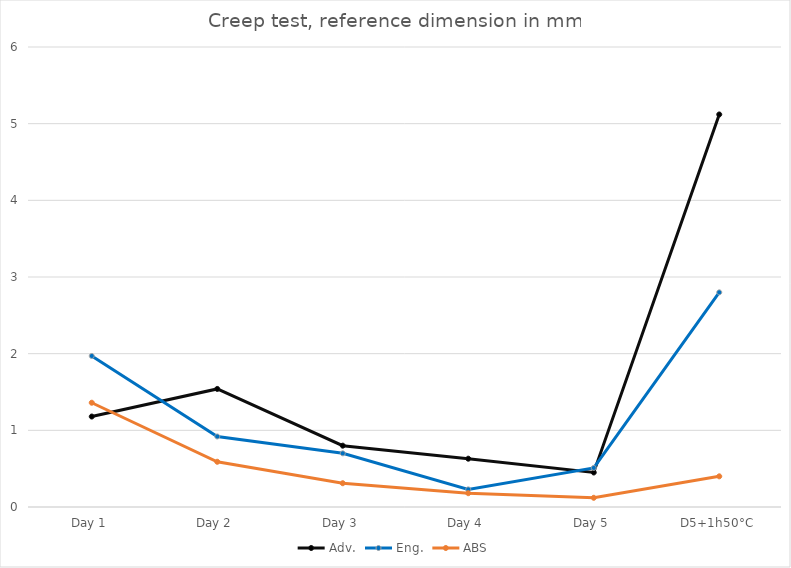
| Category | Adv. | Eng. | ABS |
|---|---|---|---|
| Day 1 | 1.18 | 1.97 | 1.36 |
| Day 2 | 1.54 | 0.92 | 0.59 |
| Day 3 | 0.8 | 0.7 | 0.31 |
| Day 4 | 0.63 | 0.23 | 0.18 |
| Day 5 | 0.45 | 0.51 | 0.12 |
| D5+1h50°C | 5.12 | 2.8 | 0.4 |